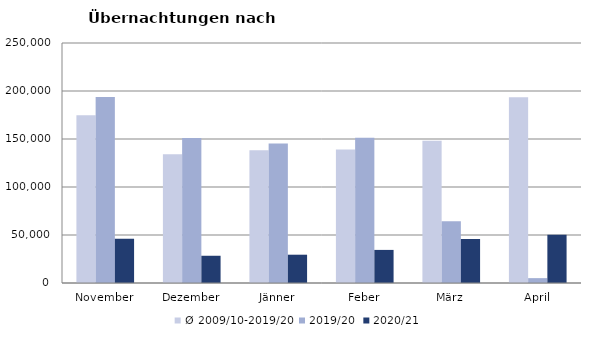
| Category | Ø 2009/10-2019/20 | 2019/20 | 2020/21 |
|---|---|---|---|
| November | 174715.364 | 193867 | 46036 |
| Dezember | 134061.727 | 151031 | 28378 |
| Jänner | 138168.273 | 145353 | 29476 |
| Feber | 139117.818 | 151431 | 34472 |
| März | 148120.182 | 64358 | 45792 |
| April | 193444 | 5072 | 50255 |